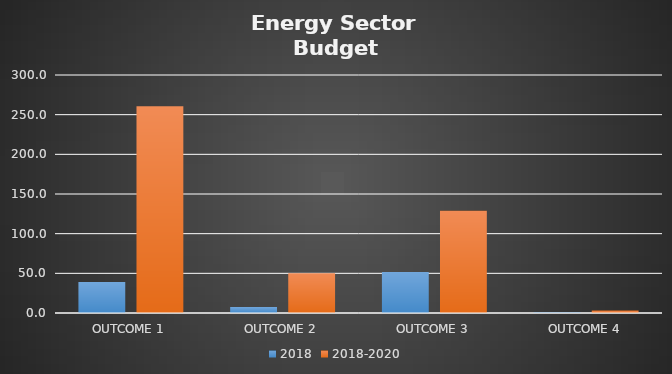
| Category | 2018 | 2018-2020 |
|---|---|---|
| OUTCOME 1 | 39.112 | 260.75 |
| OUTCOME 2 | 7.526 | 50.175 |
| OUTCOME 3 | 51.6 | 129 |
| OUTCOME 4 | 1 | 3 |